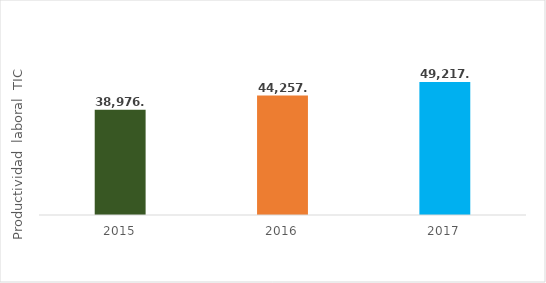
| Category | Productividad laboral del sector TIC |
|---|---|
| 2015.0 | 38976.805 |
| 2016.0 | 44257.333 |
| 2017.0 | 49217.457 |